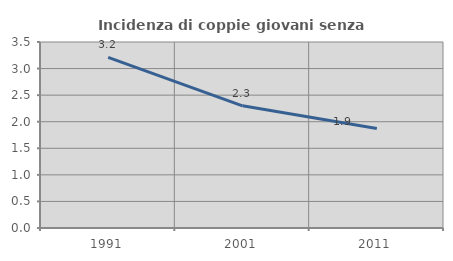
| Category | Incidenza di coppie giovani senza figli |
|---|---|
| 1991.0 | 3.212 |
| 2001.0 | 2.299 |
| 2011.0 | 1.872 |